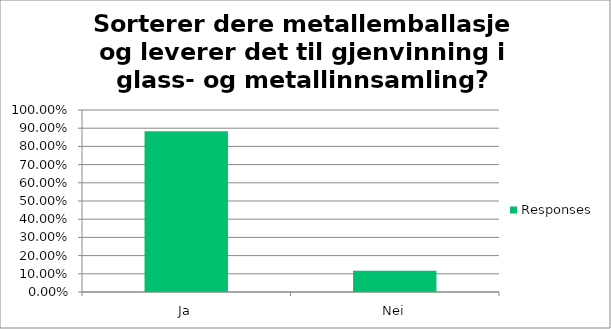
| Category | Responses |
|---|---|
| Ja | 0.884 |
| Nei | 0.116 |